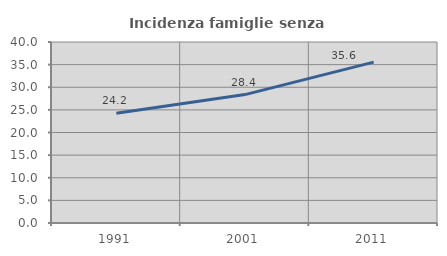
| Category | Incidenza famiglie senza nuclei |
|---|---|
| 1991.0 | 24.246 |
| 2001.0 | 28.377 |
| 2011.0 | 35.561 |